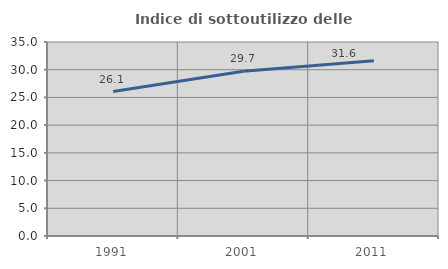
| Category | Indice di sottoutilizzo delle abitazioni  |
|---|---|
| 1991.0 | 26.053 |
| 2001.0 | 29.72 |
| 2011.0 | 31.602 |